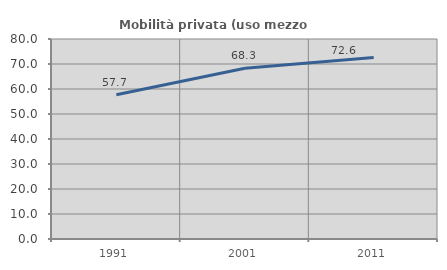
| Category | Mobilità privata (uso mezzo privato) |
|---|---|
| 1991.0 | 57.736 |
| 2001.0 | 68.29 |
| 2011.0 | 72.565 |